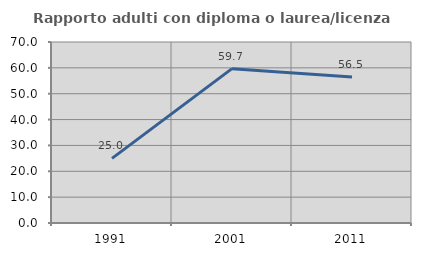
| Category | Rapporto adulti con diploma o laurea/licenza media  |
|---|---|
| 1991.0 | 25 |
| 2001.0 | 59.701 |
| 2011.0 | 56.471 |